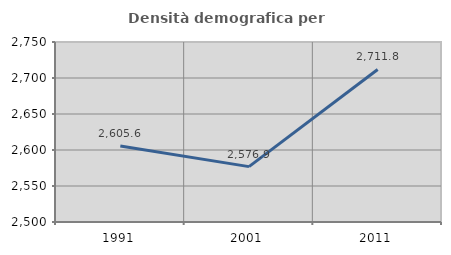
| Category | Densità demografica |
|---|---|
| 1991.0 | 2605.638 |
| 2001.0 | 2576.908 |
| 2011.0 | 2711.828 |